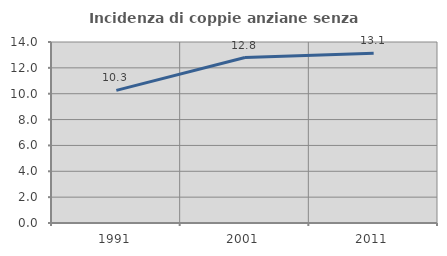
| Category | Incidenza di coppie anziane senza figli  |
|---|---|
| 1991.0 | 10.256 |
| 2001.0 | 12.798 |
| 2011.0 | 13.129 |